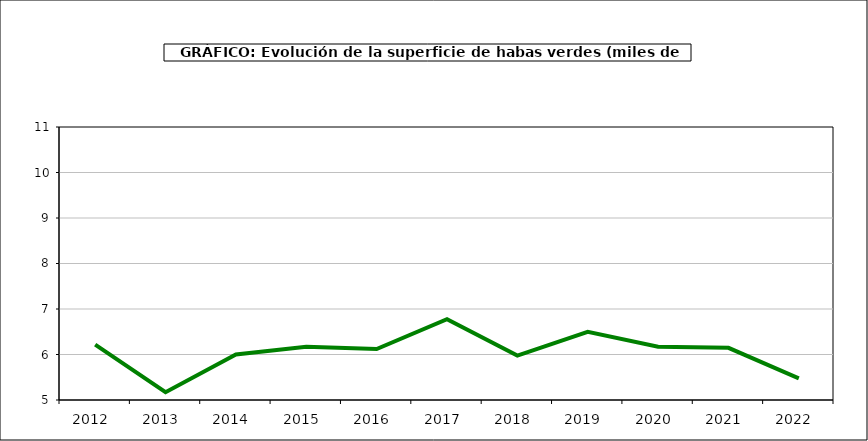
| Category | superficie |
|---|---|
| 2012.0 | 6.216 |
| 2013.0 | 5.17 |
| 2014.0 | 6.001 |
| 2015.0 | 6.169 |
| 2016.0 | 6.119 |
| 2017.0 | 6.774 |
| 2018.0 | 5.976 |
| 2019.0 | 6.497 |
| 2020.0 | 6.172 |
| 2021.0 | 6.147 |
| 2022.0 | 5.475 |